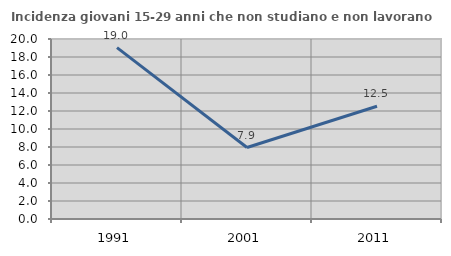
| Category | Incidenza giovani 15-29 anni che non studiano e non lavorano  |
|---|---|
| 1991.0 | 19.041 |
| 2001.0 | 7.941 |
| 2011.0 | 12.533 |